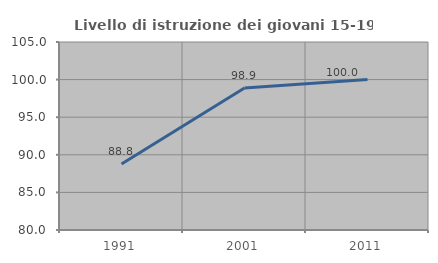
| Category | Livello di istruzione dei giovani 15-19 anni |
|---|---|
| 1991.0 | 88.785 |
| 2001.0 | 98.876 |
| 2011.0 | 100 |